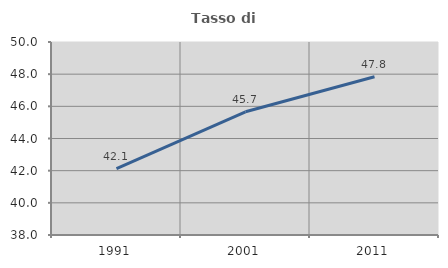
| Category | Tasso di occupazione   |
|---|---|
| 1991.0 | 42.121 |
| 2001.0 | 45.66 |
| 2011.0 | 47.836 |